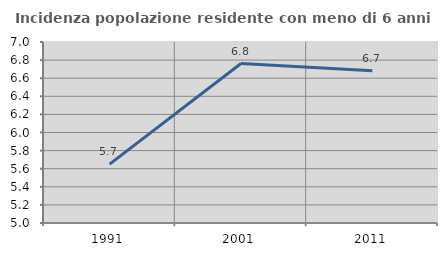
| Category | Incidenza popolazione residente con meno di 6 anni |
|---|---|
| 1991.0 | 5.651 |
| 2001.0 | 6.762 |
| 2011.0 | 6.682 |